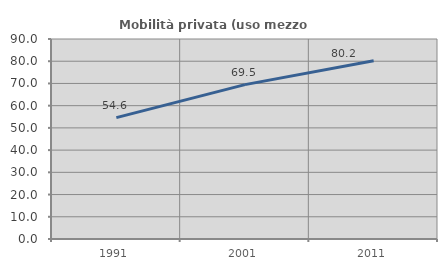
| Category | Mobilità privata (uso mezzo privato) |
|---|---|
| 1991.0 | 54.622 |
| 2001.0 | 69.466 |
| 2011.0 | 80.247 |